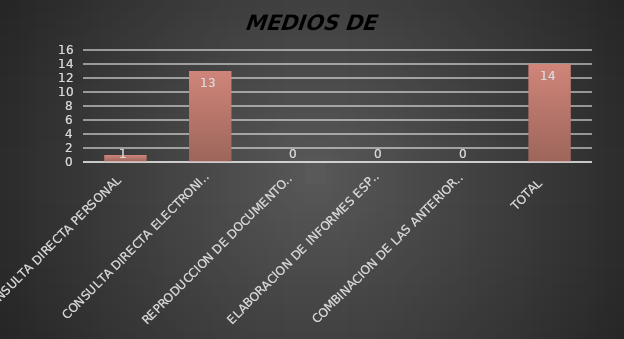
| Category | Series 1 |
|---|---|
| CONSULTA DIRECTA PERSONAL | 1 |
| CONSULTA DIRECTA ELECTRONICA | 13 |
| REPRODUCCION DE DOCUMENTOS  | 0 |
| ELABORACION DE INFORMES ESPECIFICOS  | 0 |
| COMBINACION DE LAS ANTERIORES | 0 |
| TOTAL  | 14 |